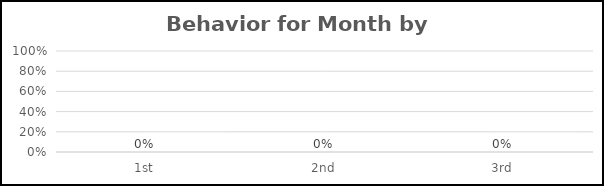
| Category | Behavior for Month by Shift |
|---|---|
| 1st | 0 |
| 2nd | 0 |
| 3rd | 0 |